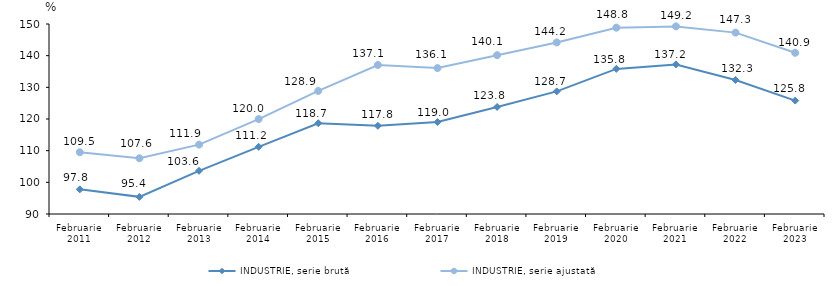
| Category | INDUSTRIE, serie brută | INDUSTRIE, serie ajustată |
|---|---|---|
| Februarie
2011 | 97.784 | 109.496 |
| Februarie
2012 | 95.411 | 107.612 |
| Februarie
2013 | 103.634 | 111.907 |
| Februarie
2014 | 111.215 | 119.98 |
| Februarie
2015 | 118.66 | 128.863 |
| Februarie
2016 | 117.842 | 137.061 |
| Februarie
2017 | 119.04 | 136.079 |
| Februarie
2018 | 123.812 | 140.146 |
| Februarie
2019 | 128.715 | 144.168 |
| Februarie
2020 | 135.826 | 148.838 |
| Februarie
2021 | 137.24 | 149.248 |
| Februarie
2022 | 132.325 | 147.278 |
| Februarie
2023 | 125.812 | 140.908 |